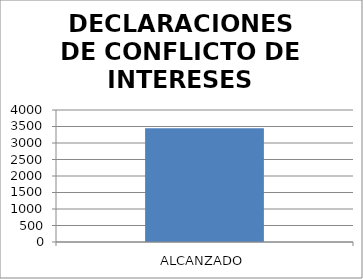
| Category | DECLARACIONES DE CONFLICTO DE INTERESES |
|---|---|
| ALCANZADO | 3449 |